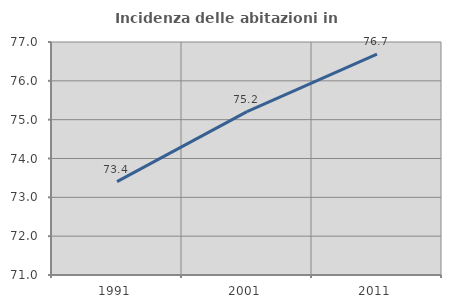
| Category | Incidenza delle abitazioni in proprietà  |
|---|---|
| 1991.0 | 73.404 |
| 2001.0 | 75.208 |
| 2011.0 | 76.69 |